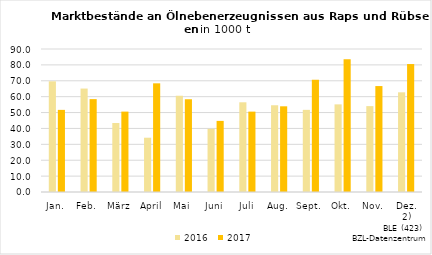
| Category | 2016 | 2017 |
|---|---|---|
| Jan. | 69.65 | 51.687 |
| Feb. | 65.104 | 58.457 |
| März | 43.443 | 50.595 |
| April | 34.165 | 68.396 |
| Mai | 60.581 | 58.382 |
| Juni | 39.769 | 44.749 |
| Juli | 56.455 | 50.587 |
| Aug. | 54.591 | 53.933 |
| Sept. | 51.701 | 70.647 |
| Okt. | 55.151 | 83.623 |
| Nov. | 54.058 | 66.672 |
| Dez. 2) | 62.737 | 80.529 |